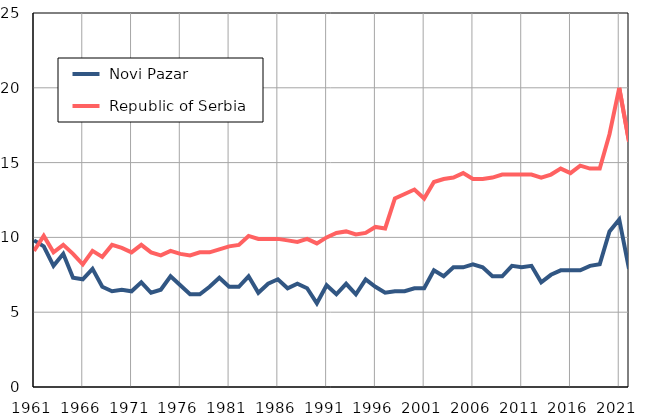
| Category |  Novi Pazar |  Republic of Serbia |
|---|---|---|
| 1961.0 | 9.8 | 9.1 |
| 1962.0 | 9.4 | 10.1 |
| 1963.0 | 8.1 | 9 |
| 1964.0 | 8.9 | 9.5 |
| 1965.0 | 7.3 | 8.9 |
| 1966.0 | 7.2 | 8.2 |
| 1967.0 | 7.9 | 9.1 |
| 1968.0 | 6.7 | 8.7 |
| 1969.0 | 6.4 | 9.5 |
| 1970.0 | 6.5 | 9.3 |
| 1971.0 | 6.4 | 9 |
| 1972.0 | 7 | 9.5 |
| 1973.0 | 6.3 | 9 |
| 1974.0 | 6.5 | 8.8 |
| 1975.0 | 7.4 | 9.1 |
| 1976.0 | 6.8 | 8.9 |
| 1977.0 | 6.2 | 8.8 |
| 1978.0 | 6.2 | 9 |
| 1979.0 | 6.7 | 9 |
| 1980.0 | 7.3 | 9.2 |
| 1981.0 | 6.7 | 9.4 |
| 1982.0 | 6.7 | 9.5 |
| 1983.0 | 7.4 | 10.1 |
| 1984.0 | 6.3 | 9.9 |
| 1985.0 | 6.9 | 9.9 |
| 1986.0 | 7.2 | 9.9 |
| 1987.0 | 6.6 | 9.8 |
| 1988.0 | 6.9 | 9.7 |
| 1989.0 | 6.6 | 9.9 |
| 1990.0 | 5.6 | 9.6 |
| 1991.0 | 6.8 | 10 |
| 1992.0 | 6.2 | 10.3 |
| 1993.0 | 6.9 | 10.4 |
| 1994.0 | 6.2 | 10.2 |
| 1995.0 | 7.2 | 10.3 |
| 1996.0 | 6.7 | 10.7 |
| 1997.0 | 6.3 | 10.6 |
| 1998.0 | 6.4 | 12.6 |
| 1999.0 | 6.4 | 12.9 |
| 2000.0 | 6.6 | 13.2 |
| 2001.0 | 6.6 | 12.6 |
| 2002.0 | 7.8 | 13.7 |
| 2003.0 | 7.4 | 13.9 |
| 2004.0 | 8 | 14 |
| 2005.0 | 8 | 14.3 |
| 2006.0 | 8.2 | 13.9 |
| 2007.0 | 8 | 13.9 |
| 2008.0 | 7.4 | 14 |
| 2009.0 | 7.4 | 14.2 |
| 2010.0 | 8.1 | 14.2 |
| 2011.0 | 8 | 14.2 |
| 2012.0 | 8.1 | 14.2 |
| 2013.0 | 7 | 14 |
| 2014.0 | 7.5 | 14.2 |
| 2015.0 | 7.8 | 14.6 |
| 2016.0 | 7.8 | 14.3 |
| 2017.0 | 7.8 | 14.8 |
| 2018.0 | 8.1 | 14.6 |
| 2019.0 | 8.2 | 14.6 |
| 2020.0 | 10.4 | 16.9 |
| 2021.0 | 11.2 | 20 |
| 2022.0 | 7.9 | 16.4 |